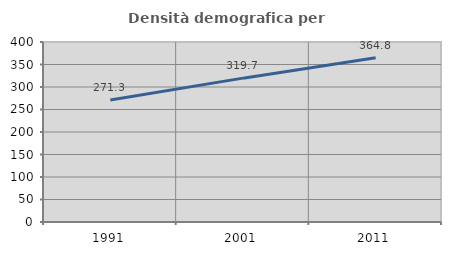
| Category | Densità demografica |
|---|---|
| 1991.0 | 271.259 |
| 2001.0 | 319.68 |
| 2011.0 | 364.804 |